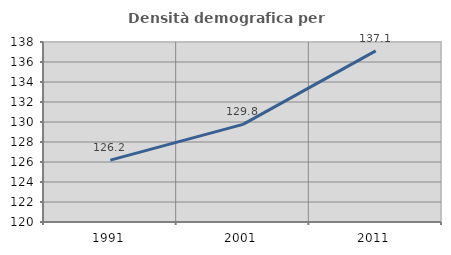
| Category | Densità demografica |
|---|---|
| 1991.0 | 126.188 |
| 2001.0 | 129.76 |
| 2011.0 | 137.113 |